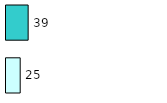
| Category | Series 0 | Series 1 |
|---|---|---|
| 0 | 25 | 39 |